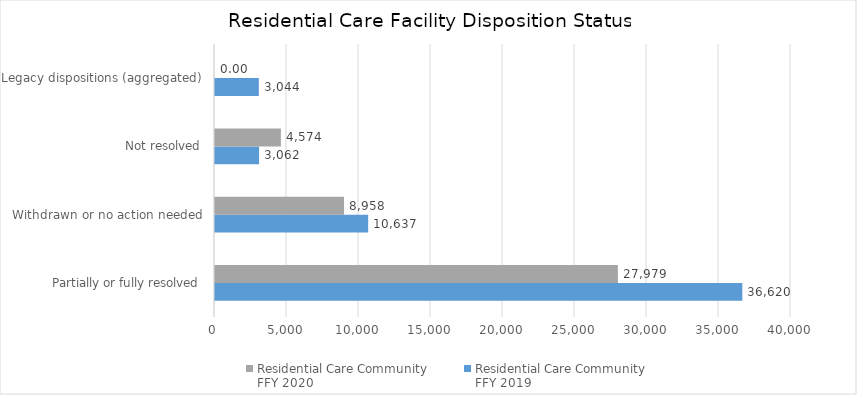
| Category | Residential Care Community 
FFY 2019 | Residential Care Community 
FFY 2020 |
|---|---|---|
| Partially or fully resolved | 36620 | 27979 |
| Withdrawn or no action needed | 10637 | 8958 |
| Not resolved | 3062 | 4574 |
| Legacy dispositions (aggregated) | 3044 | 0 |